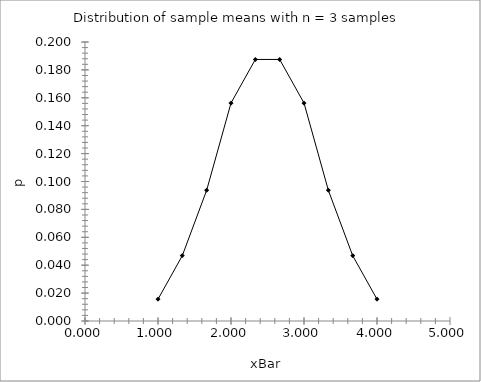
| Category | Series 0 |
|---|---|
| 1.0 | 0.016 |
| 1.3333 | 0.047 |
| 1.6667 | 0.094 |
| 2.0 | 0.156 |
| 2.3333 | 0.188 |
| 2.6667 | 0.188 |
| 3.0 | 0.156 |
| 3.3333 | 0.094 |
| 3.6667 | 0.047 |
| 4.0 | 0.016 |